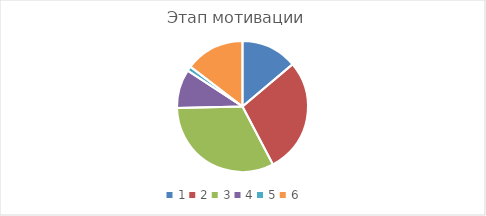
| Category | Series 0 |
|---|---|
| 0 | 0.141 |
| 1 | 0.29 |
| 2 | 0.329 |
| 3 | 0.098 |
| 4 | 0.012 |
| 5 | 0.149 |